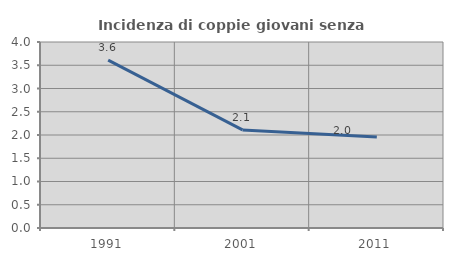
| Category | Incidenza di coppie giovani senza figli |
|---|---|
| 1991.0 | 3.61 |
| 2001.0 | 2.11 |
| 2011.0 | 1.955 |